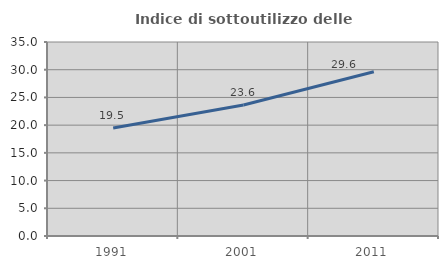
| Category | Indice di sottoutilizzo delle abitazioni  |
|---|---|
| 1991.0 | 19.498 |
| 2001.0 | 23.621 |
| 2011.0 | 29.633 |